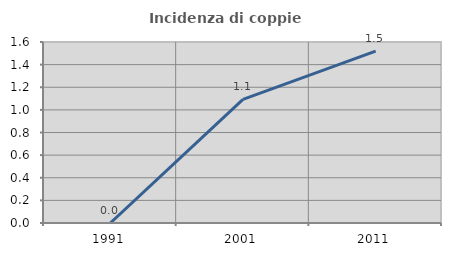
| Category | Incidenza di coppie miste |
|---|---|
| 1991.0 | 0 |
| 2001.0 | 1.093 |
| 2011.0 | 1.519 |